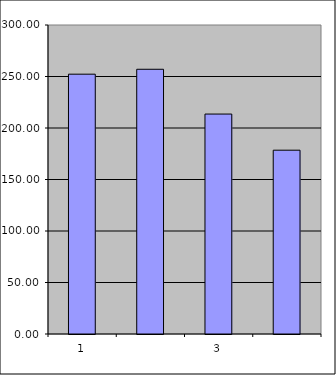
| Category | Series 0 |
|---|---|
| 0 | 252.25 |
| 1 | 257.012 |
| 2 | 213.536 |
| 3 | 178.458 |